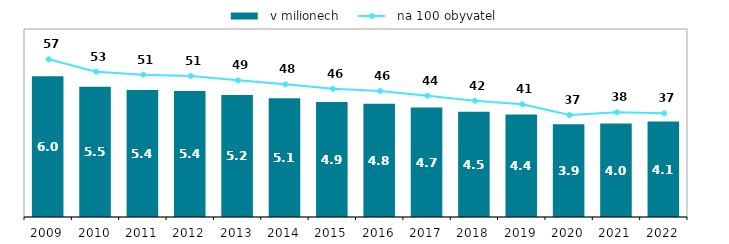
| Category |   v milionech |
|---|---|
| 2009.0 | 5.993 |
| 2010.0 | 5.538 |
| 2011.0 | 5.409 |
| 2012.0 | 5.362 |
| 2013.0 | 5.195 |
| 2014.0 | 5.055 |
| 2015.0 | 4.893 |
| 2016.0 | 4.821 |
| 2017.0 | 4.656 |
| 2018.0 | 4.48 |
| 2019.0 | 4.362 |
| 2020.0 | 3.947 |
| 2021.0 | 3.982 |
| 2022.0 | 4.059 |